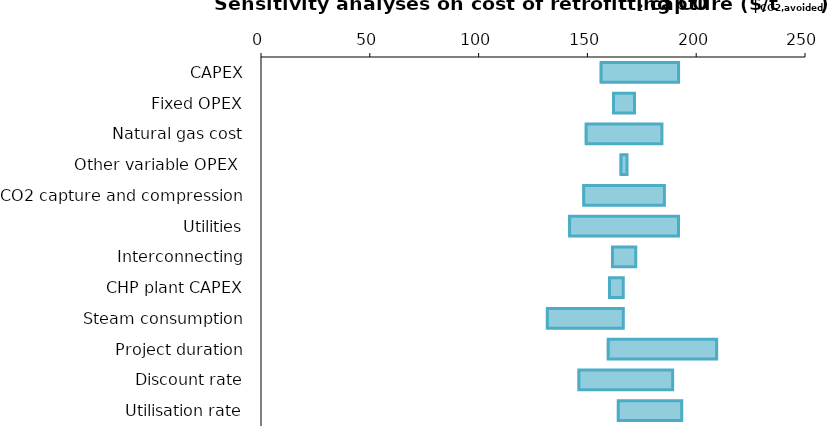
| Category | Minimum value | Increase of the parameter |
|---|---|---|
| CAPEX | 155.606 | 36.304 |
| Fixed OPEX | 161.305 | 10.384 |
| Natural gas cost | 148.751 | 35.492 |
| Other variable OPEX  | 164.741 | 3.511 |
| CO2 capture and compression | 147.618 | 37.758 |
| Utilities | 141.119 | 50.756 |
| Interconnecting | 160.805 | 11.384 |
| CHP plant CAPEX | 159.518 | 6.978 |
| Steam consumption | 130.909 | 35.588 |
| Project duration | 158.887 | 50.511 |
| Discount rate | 145.411 | 43.77 |
| Utilisation rate | 163.513 | 29.839 |